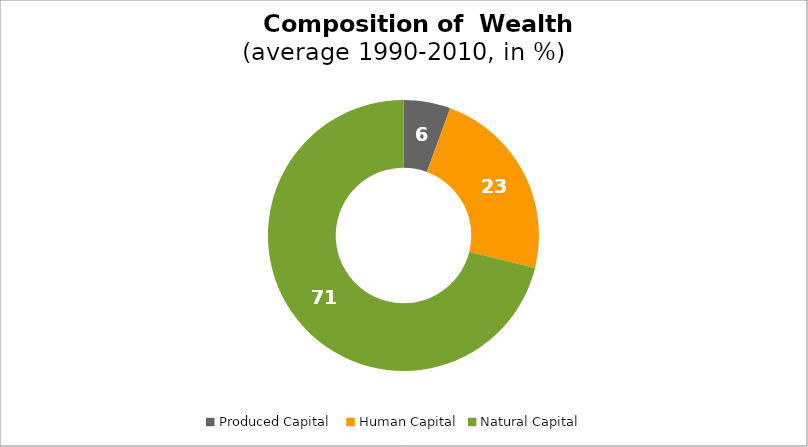
| Category | Series 0 |
|---|---|
| Produced Capital  | 5.601 |
| Human Capital | 23.245 |
| Natural Capital | 71.154 |